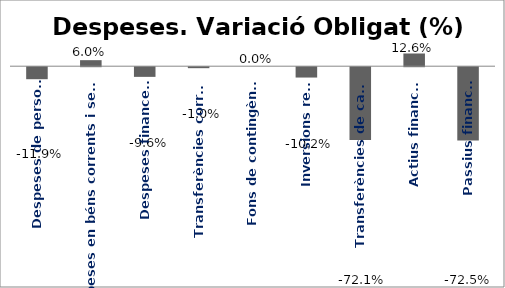
| Category | Series 0 |
|---|---|
| Despeses de personal | -0.119 |
| Despeses en béns corrents i serveis | 0.06 |
| Despeses financeres | -0.096 |
| Transferències corrents | -0.01 |
| Fons de contingència | 0 |
| Inversions reals | -0.102 |
| Transferències de capital | -0.721 |
| Actius financers | 0.126 |
| Passius financers | -0.725 |